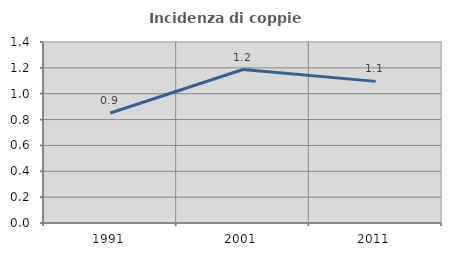
| Category | Incidenza di coppie miste |
|---|---|
| 1991.0 | 0.851 |
| 2001.0 | 1.187 |
| 2011.0 | 1.095 |